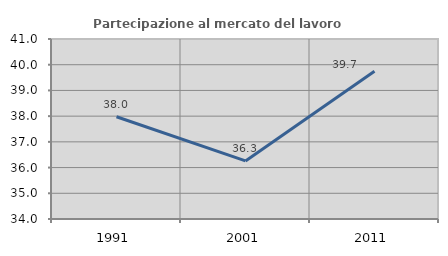
| Category | Partecipazione al mercato del lavoro  femminile |
|---|---|
| 1991.0 | 37.975 |
| 2001.0 | 36.258 |
| 2011.0 | 39.75 |